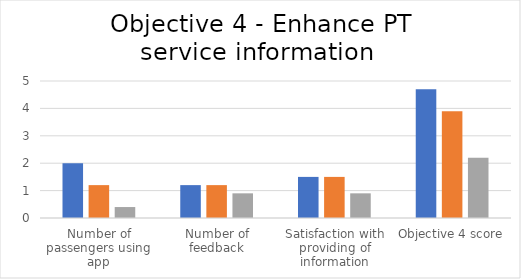
| Category | Series 0 | Series 1 | Series 2 |
|---|---|---|---|
| Number of passengers using app | 2 | 1.2 | 0.4 |
| Number of feedback | 1.2 | 1.2 | 0.9 |
| Satisfaction with providing of information | 1.5 | 1.5 | 0.9 |
| Objective 4 score | 4.7 | 3.9 | 2.2 |